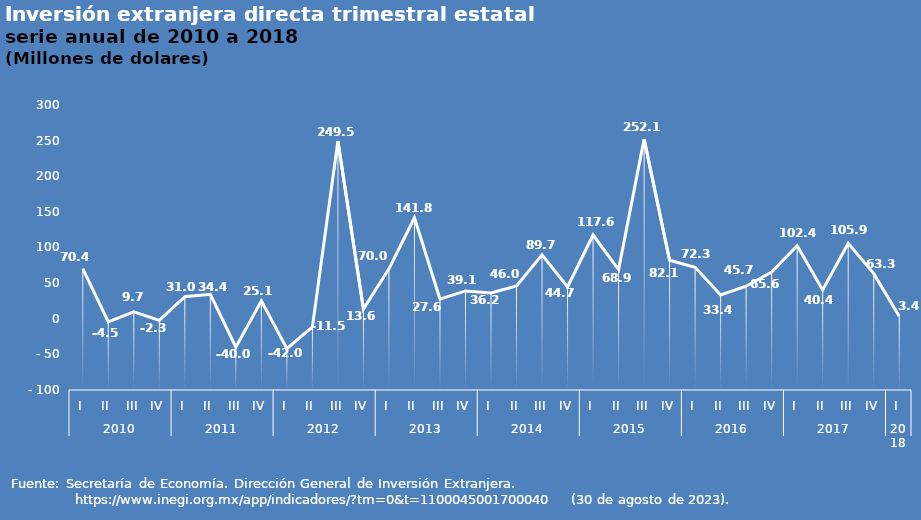
| Category | Inversión extranjera directa |
|---|---|
| 0 | 70.392 |
| 1 | -4.512 |
| 2 | 9.655 |
| 3 | -2.331 |
| 4 | 30.994 |
| 5 | 34.418 |
| 6 | -40.01 |
| 7 | 25.141 |
| 8 | -41.959 |
| 9 | -11.483 |
| 10 | 249.47 |
| 11 | 13.647 |
| 12 | 69.994 |
| 13 | 141.778 |
| 14 | 27.624 |
| 15 | 39.054 |
| 16 | 36.223 |
| 17 | 45.952 |
| 18 | 89.724 |
| 19 | 44.683 |
| 20 | 117.557 |
| 21 | 68.906 |
| 22 | 252.123 |
| 23 | 82.137 |
| 24 | 72.322 |
| 25 | 33.434 |
| 26 | 45.681 |
| 27 | 65.559 |
| 28 | 102.359 |
| 29 | 40.408 |
| 30 | 105.864 |
| 31 | 63.288 |
| 32 | 3.427 |